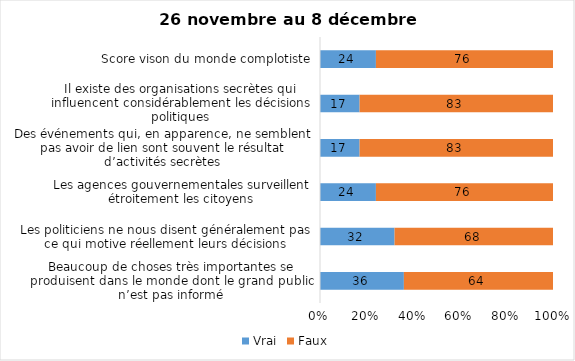
| Category | Vrai | Faux |
|---|---|---|
| Beaucoup de choses très importantes se produisent dans le monde dont le grand public n’est pas informé | 36 | 64 |
| Les politiciens ne nous disent généralement pas ce qui motive réellement leurs décisions | 32 | 68 |
| Les agences gouvernementales surveillent étroitement les citoyens | 24 | 76 |
| Des événements qui, en apparence, ne semblent pas avoir de lien sont souvent le résultat d’activités secrètes | 17 | 83 |
| Il existe des organisations secrètes qui influencent considérablement les décisions politiques | 17 | 83 |
| Score vison du monde complotiste | 24 | 76 |